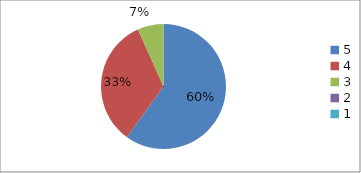
| Category | Series 0 | Series 1 |
|---|---|---|
| 5.0 | 60 | 60 |
| 4.0 | 33.3 | 33.3 |
| 3.0 | 6.7 | 6.7 |
| 2.0 | 0 | 0 |
| 1.0 | 0 | 0 |